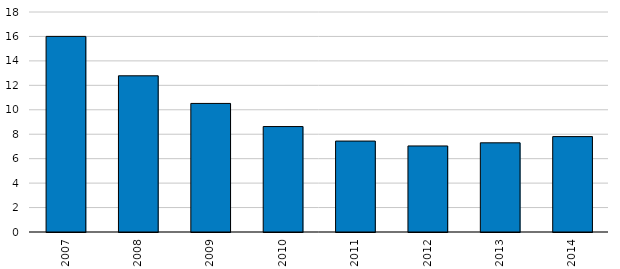
| Category | Series 0 |
|---|---|
| 2007-01-01 | 16.004 |
| 2008-01-01 | 12.779 |
| 2009-01-01 | 10.52 |
| 2010-01-01 | 8.628 |
| 2011-01-01 | 7.439 |
| 2012-01-01 | 7.04 |
| 2013-01-01 | 7.297 |
| 2014-01-01 | 7.806 |